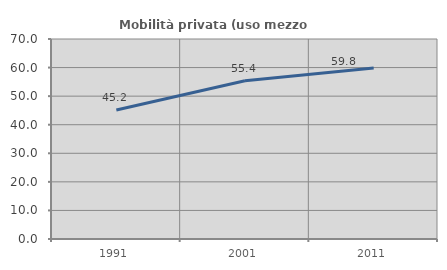
| Category | Mobilità privata (uso mezzo privato) |
|---|---|
| 1991.0 | 45.161 |
| 2001.0 | 55.364 |
| 2011.0 | 59.815 |